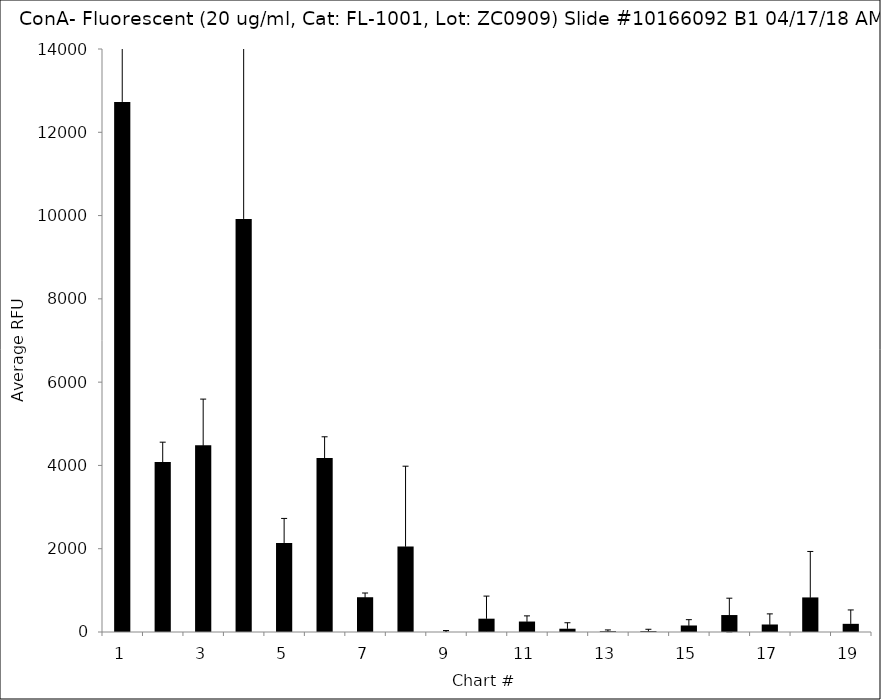
| Category | Series 0 |
|---|---|
| 1.0 | 12730.25 |
| 2.0 | 4079.5 |
| 3.0 | 4484.5 |
| 4.0 | 9920 |
| 5.0 | 2139 |
| 6.0 | 4176.5 |
| 7.0 | 834.75 |
| 8.0 | 2056 |
| 9.0 | -16.75 |
| 10.0 | 319.75 |
| 11.0 | 251.25 |
| 12.0 | 78.75 |
| 13.0 | 17.75 |
| 14.0 | 18.5 |
| 15.0 | 156.5 |
| 16.0 | 407.25 |
| 17.0 | 180.25 |
| 18.0 | 830.25 |
| 19.0 | 196.25 |